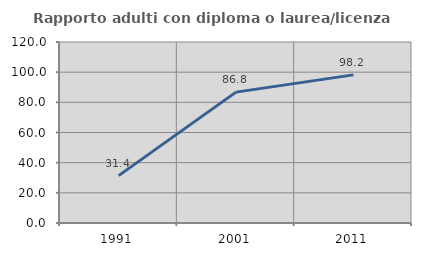
| Category | Rapporto adulti con diploma o laurea/licenza media  |
|---|---|
| 1991.0 | 31.405 |
| 2001.0 | 86.771 |
| 2011.0 | 98.203 |